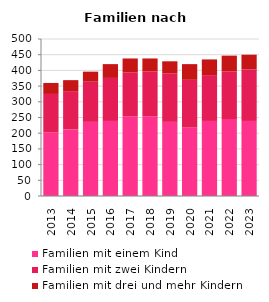
| Category | Familien mit einem Kind | Familien mit zwei Kindern | Familien mit drei und mehr Kindern |
|---|---|---|---|
| 2013.0 | 203 | 122 | 35 |
| 2014.0 | 212 | 122 | 35 |
| 2015.0 | 236 | 128 | 32 |
| 2016.0 | 239 | 137 | 44 |
| 2017.0 | 254 | 140 | 44 |
| 2018.0 | 254 | 143 | 41 |
| 2019.0 | 236 | 155 | 38 |
| 2020.0 | 218 | 152 | 50 |
| 2021.0 | 239 | 146 | 50 |
| 2022.0 | 245 | 152 | 50 |
| 2023.0 | 239 | 164 | 47 |